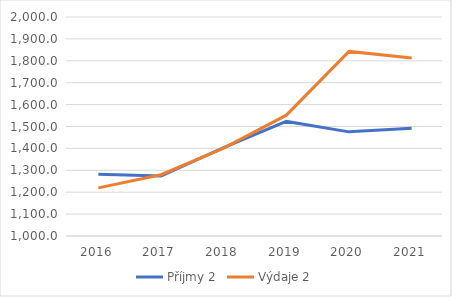
| Category | Příjmy 2 | Výdaje 2 |
|---|---|---|
| 2016.0 | 1281.62 | 1219.84 |
| 2017.0 | 1273.64 | 1279.8 |
| 2018.0 | 1403.92 | 1400.97 |
| 2019.0 | 1523.23 | 1551.74 |
| 2020.0 | 1475.5 | 1842.9 |
| 2021.0 | 1492 | 1812.7 |